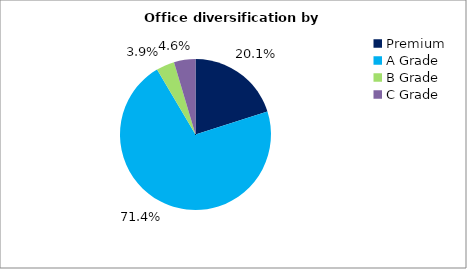
| Category | Series 0 |
|---|---|
| Premium | 0.201 |
| A Grade | 0.714 |
| B Grade | 0.039 |
| C Grade | 0.046 |